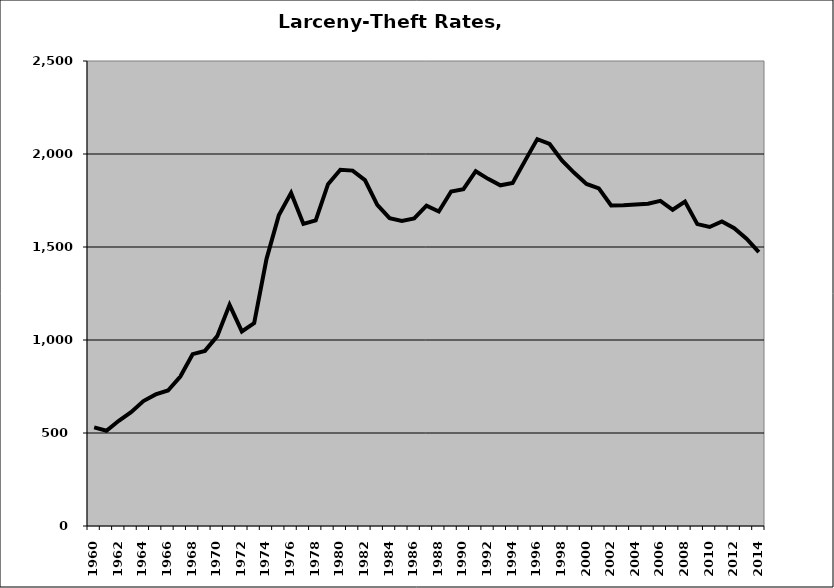
| Category | Larceny-Theft |
|---|---|
| 1960.0 | 530.268 |
| 1961.0 | 512.112 |
| 1962.0 | 565.744 |
| 1963.0 | 612.001 |
| 1964.0 | 671.813 |
| 1965.0 | 707.257 |
| 1966.0 | 728.665 |
| 1967.0 | 803.87 |
| 1968.0 | 923.873 |
| 1969.0 | 941.405 |
| 1970.0 | 1020.696 |
| 1971.0 | 1188.972 |
| 1972.0 | 1045.975 |
| 1973.0 | 1090.657 |
| 1974.0 | 1435.032 |
| 1975.0 | 1669.992 |
| 1976.0 | 1790.794 |
| 1977.0 | 1624.073 |
| 1978.0 | 1642.996 |
| 1979.0 | 1837.584 |
| 1980.0 | 1915.526 |
| 1981.0 | 1910.831 |
| 1982.0 | 1859.444 |
| 1983.0 | 1726.843 |
| 1984.0 | 1655.315 |
| 1985.0 | 1640.656 |
| 1986.0 | 1654.109 |
| 1987.0 | 1722.679 |
| 1988.0 | 1690.879 |
| 1989.0 | 1798.721 |
| 1990.0 | 1810.516 |
| 1991.0 | 1907.382 |
| 1992.0 | 1866.517 |
| 1993.0 | 1831.698 |
| 1994.0 | 1844.341 |
| 1995.0 | 1963.146 |
| 1996.0 | 2079.944 |
| 1997.0 | 2054.01 |
| 1998.0 | 1965.445 |
| 1999.0 | 1898.864 |
| 2000.0 | 1839.166 |
| 2001.0 | 1815.396 |
| 2002.0 | 1723.124 |
| 2003.0 | 1724.057 |
| 2004.0 | 1728.182 |
| 2005.0 | 1732.446 |
| 2006.0 | 1748.201 |
| 2007.0 | 1700.205 |
| 2008.0 | 1743.758 |
| 2009.0 | 1623.1 |
| 2010.0 | 1607.439 |
| 2011.0 | 1636.887 |
| 2012.0 | 1601.39 |
| 2013.0 | 1544.523 |
| 2014.0 | 1472.221 |